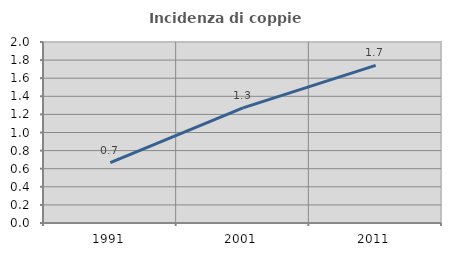
| Category | Incidenza di coppie miste |
|---|---|
| 1991.0 | 0.667 |
| 2001.0 | 1.271 |
| 2011.0 | 1.742 |